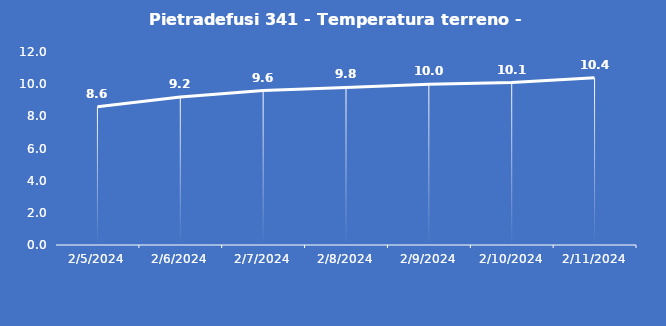
| Category | Pietradefusi 341 - Temperatura terreno - Grezzo (°C) |
|---|---|
| 2/5/24 | 8.6 |
| 2/6/24 | 9.2 |
| 2/7/24 | 9.6 |
| 2/8/24 | 9.8 |
| 2/9/24 | 10 |
| 2/10/24 | 10.1 |
| 2/11/24 | 10.4 |